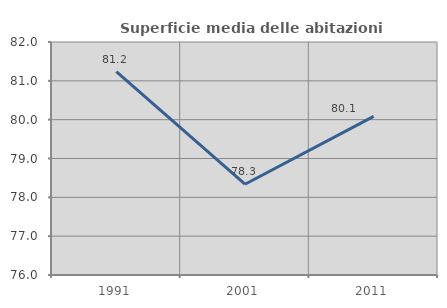
| Category | Superficie media delle abitazioni occupate |
|---|---|
| 1991.0 | 81.24 |
| 2001.0 | 78.338 |
| 2011.0 | 80.086 |